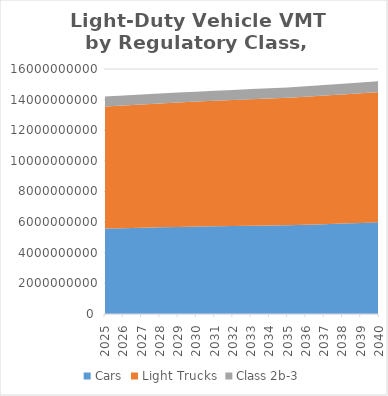
| Category | Cars | Light Trucks | Class 2b-3 |
|---|---|---|---|
| 2025.0 | 5580069143.803 | 7963861949.471 | 657906622.769 |
| 2026.0 | 5606492918.028 | 8002595910.155 | 656631328.615 |
| 2027.0 | 5632916692.254 | 8041329870.839 | 655356034.462 |
| 2028.0 | 5659340466.479 | 8080063831.523 | 654080740.308 |
| 2029.0 | 5685764240.705 | 8118797792.207 | 652805446.154 |
| 2030.0 | 5712188014.93 | 8157531752.891 | 651530152 |
| 2031.0 | 5727671280.963 | 8191019257.257 | 657738294.893 |
| 2032.0 | 5743154546.997 | 8224506761.623 | 663946437.787 |
| 2033.0 | 5758637813.03 | 8257994265.989 | 670154580.68 |
| 2034.0 | 5774121079.064 | 8291481770.355 | 676362723.574 |
| 2035.0 | 5789604345.097 | 8324969274.721 | 682570866.467 |
| 2036.0 | 5829185158.513 | 8361132190.602 | 688894555.174 |
| 2037.0 | 5868765971.929 | 8397295106.484 | 695218243.88 |
| 2038.0 | 5908346785.345 | 8433458022.365 | 701541932.587 |
| 2039.0 | 5947927598.761 | 8469620938.247 | 707865621.293 |
| 2040.0 | 5987508412.176 | 8505783854.128 | 714189310 |